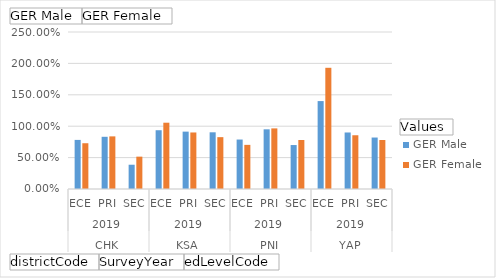
| Category | GER Male | GER Female |
|---|---|---|
| 0 | 0.782 | 0.729 |
| 1 | 0.831 | 0.838 |
| 2 | 0.386 | 0.515 |
| 3 | 0.936 | 1.056 |
| 4 | 0.914 | 0.9 |
| 5 | 0.903 | 0.826 |
| 6 | 0.788 | 0.703 |
| 7 | 0.95 | 0.965 |
| 8 | 0.7 | 0.78 |
| 9 | 1.4 | 1.93 |
| 10 | 0.9 | 0.856 |
| 11 | 0.82 | 0.78 |